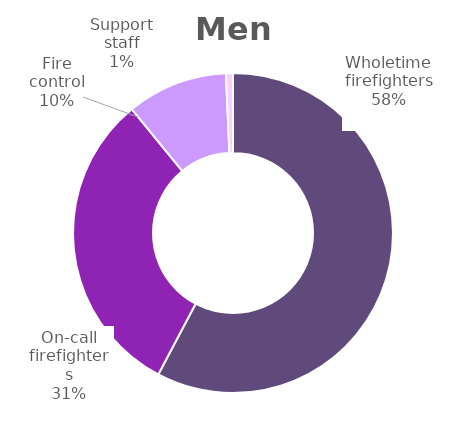
| Category | Men |
|---|---|
| Wholetime firefighters | 0.577 |
| On-call firefighters | 0.314 |
| Fire control | 0.102 |
| Support staff | 0.007 |